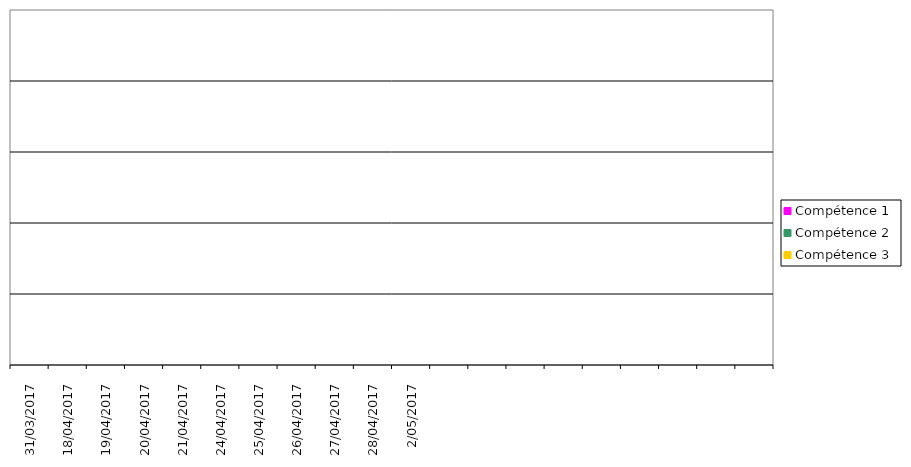
| Category | Compétence 1 | Compétence 2 | Compétence 3 |
|---|---|---|---|
| 31/03/2017 | 0 | 0 | 0 |
| 18/04/2017 | 0 | 0 | 0 |
| 19/04/2017 | 0 | 0 | 0 |
| 20/04/2017 | 0 | 0 | 0 |
| 21/04/2017 | 0 | 0 | 0 |
| 24/04/2017 | 0 | 0 | 0 |
| 25/04/2017 | 0 | 0 | 0 |
| 26/04/2017 | 0 | 0 | 0 |
| 27/04/2017 | 0 | 0 | 0 |
| 28/04/2017 | 0 | 0 | 0 |
| 2/05/2017 | 0 | 0 | 0 |